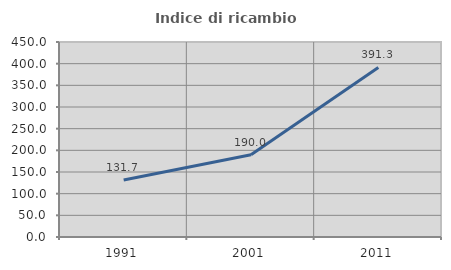
| Category | Indice di ricambio occupazionale  |
|---|---|
| 1991.0 | 131.707 |
| 2001.0 | 190 |
| 2011.0 | 391.304 |